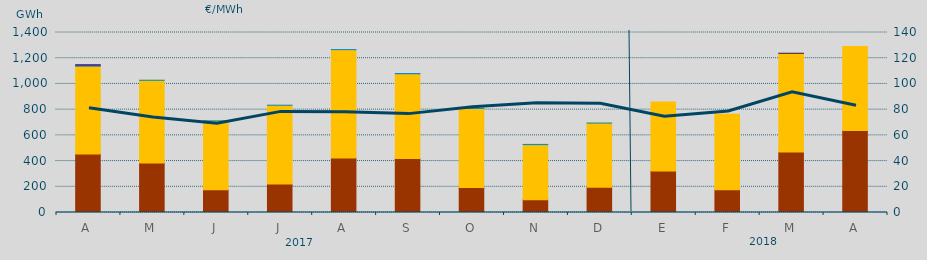
| Category | Carbón | Ciclo Combinado | Hidráulica | Nuclear | Otras Renovables |
|---|---|---|---|---|---|
| A | 454829.4 | 684899.6 | 1412 | 9600 | 0 |
| M | 384999.4 | 642959.4 | 538 | 0 | 0 |
| J | 176734.4 | 535700.2 | 240 | 0 | 0 |
| J | 221645.5 | 612390.3 | 245 | 0 | 0 |
| A | 424631 | 842008.2 | 714.3 | 0 | 0 |
| S | 419522.2 | 659557.1 | 1903.2 | 0 | 0 |
| O | 195163.5 | 613794.4 | 1865.1 | 0 | 0 |
| N | 99779.8 | 428275.6 | 1458.4 | 0 | 0 |
| D | 195559 | 499810.1 | 237.7 | 0 | 0 |
| E | 323414.2 | 535924.4 | 0 | 0 | 0 |
| F | 176086.6 | 587965.4 | 0 | 0 | 0 |
| M | 469679.3 | 766935.8 | 790 | 0 | 1096.8 |
| A | 637382 | 653437.2 | 0 | 0 | 0 |